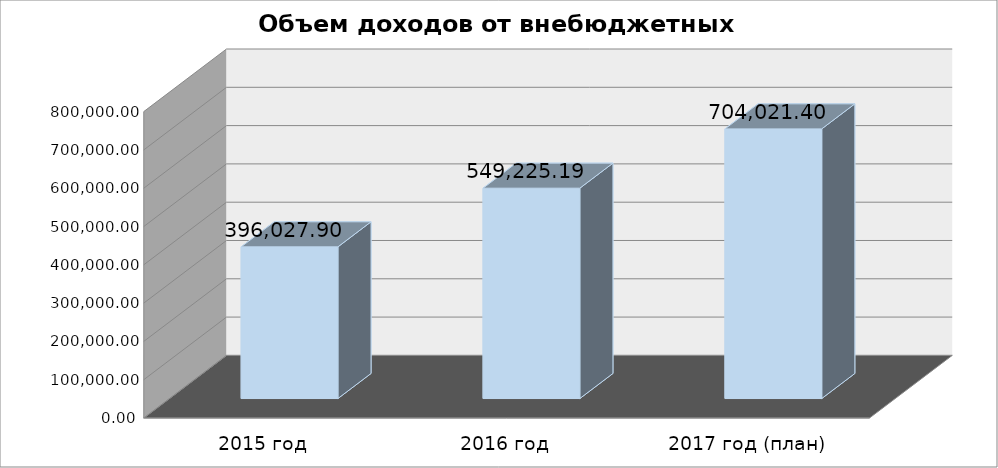
| Category | Series 0 |
|---|---|
| 2015 год | 396027.9 |
| 2016 год | 549225.19 |
| 2017 год (план) | 704021.4 |